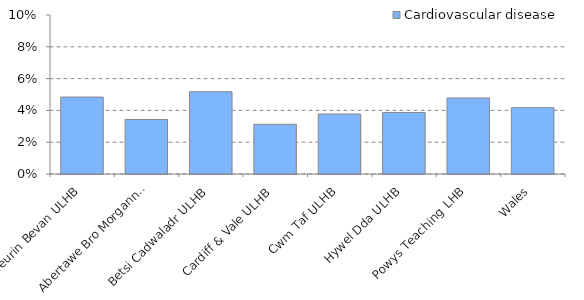
| Category | Cardiovascular disease |
|---|---|
| Aneurin Bevan ULHB | 0.048 |
| Abertawe Bro Morgannwg ULHB | 0.034 |
| Betsi Cadwaladr ULHB | 0.052 |
| Cardiff & Vale ULHB | 0.031 |
| Cwm Taf ULHB | 0.038 |
| Hywel Dda ULHB | 0.039 |
| Powys Teaching LHB | 0.048 |
| Wales | 0.042 |